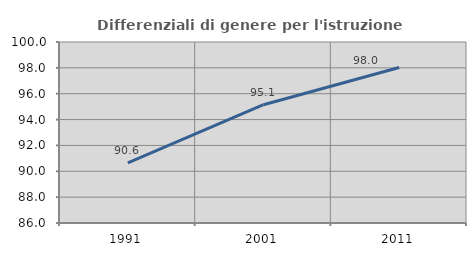
| Category | Differenziali di genere per l'istruzione superiore |
|---|---|
| 1991.0 | 90.647 |
| 2001.0 | 95.15 |
| 2011.0 | 98.032 |